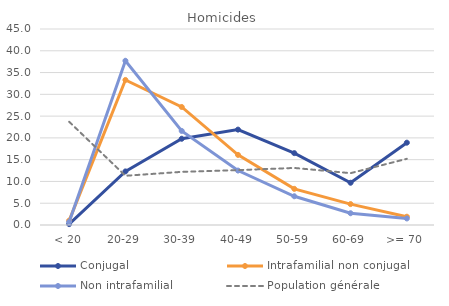
| Category | Conjugal | Intrafamilial non conjugal | Non intrafamilial | Population générale |
|---|---|---|---|---|
| < 20 | 0.2 | 1 | 0.7 | 23.7 |
| 20-29 | 12.3 | 33.3 | 37.7 | 11.3 |
| 30-39 | 19.8 | 27.1 | 21.6 | 12.2 |
| 40-49 | 21.9 | 16.1 | 12.5 | 12.6 |
| 50-59 | 16.5 | 8.3 | 6.6 | 13.1 |
| 60-69 | 9.7 | 4.8 | 2.7 | 11.9 |
| >= 70 | 18.9 | 1.9 | 1.5 | 15.2 |